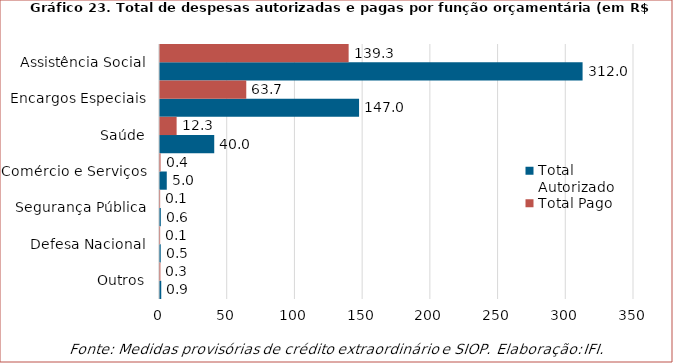
| Category | Total Autorizado | Total Pago |
|---|---|---|
| Outros | 0.926 | 0.284 |
| Defesa Nacional | 0.531 | 0.097 |
| Segurança Pública | 0.59 | 0.099 |
| Comércio e Serviços | 5 | 0.388 |
| Saúde | 40.048 | 12.277 |
| Encargos Especiais | 146.989 | 63.701 |
| Assistência Social | 312.034 | 139.292 |